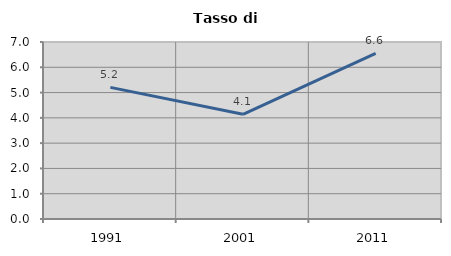
| Category | Tasso di disoccupazione   |
|---|---|
| 1991.0 | 5.205 |
| 2001.0 | 4.141 |
| 2011.0 | 6.552 |